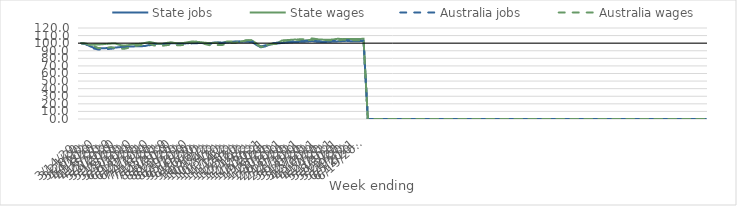
| Category | State jobs | State wages | Australia jobs | Australia wages |
|---|---|---|---|---|
| 14/03/2020 | 100 | 100 | 100 | 100 |
| 21/03/2020 | 99.006 | 98.823 | 98.971 | 99.604 |
| 28/03/2020 | 96.04 | 97.651 | 95.467 | 98.106 |
| 04/04/2020 | 93.963 | 98.119 | 92.922 | 96.239 |
| 11/04/2020 | 93.081 | 98.116 | 91.648 | 93.488 |
| 18/04/2020 | 93.187 | 98.667 | 91.632 | 93.693 |
| 25/04/2020 | 93.549 | 98.967 | 92.163 | 94.114 |
| 02/05/2020 | 93.881 | 99.429 | 92.661 | 94.661 |
| 09/05/2020 | 94.154 | 99.55 | 93.345 | 93.586 |
| 16/05/2020 | 94.774 | 97.702 | 93.938 | 92.82 |
| 23/05/2020 | 95.252 | 96.761 | 94.296 | 92.472 |
| 30/05/2020 | 95.409 | 97.328 | 94.804 | 93.802 |
| 06/06/2020 | 95.648 | 98.72 | 95.79 | 95.983 |
| 13/06/2020 | 95.904 | 98.745 | 96.291 | 96.659 |
| 20/06/2020 | 95.927 | 99.367 | 96.307 | 97.626 |
| 27/06/2020 | 96.358 | 100.405 | 95.924 | 97.398 |
| 04/07/2020 | 97.747 | 101.627 | 97.286 | 99.305 |
| 11/07/2020 | 98.921 | 100.388 | 98.453 | 96.936 |
| 18/07/2020 | 98.881 | 99.093 | 98.574 | 96.771 |
| 25/07/2020 | 99.025 | 99.092 | 98.8 | 96.557 |
| 01/08/2020 | 99.491 | 100.29 | 99.036 | 97.398 |
| 08/08/2020 | 99.735 | 101.152 | 99.039 | 97.865 |
| 15/08/2020 | 99.722 | 100.116 | 98.915 | 97.373 |
| 22/08/2020 | 99.63 | 99.797 | 99.01 | 97.336 |
| 29/08/2020 | 99.515 | 100.336 | 99.05 | 97.544 |
| 05/09/2020 | 99.94 | 101.32 | 99.381 | 100.291 |
| 12/09/2020 | 100.436 | 102.284 | 99.754 | 101.228 |
| 19/09/2020 | 100.439 | 101.783 | 99.918 | 101.971 |
| 26/09/2020 | 100.197 | 101.24 | 99.725 | 101.154 |
| 03/10/2020 | 99.791 | 100.485 | 98.937 | 98.795 |
| 10/10/2020 | 99.911 | 100.095 | 99.064 | 97.403 |
| 17/10/2020 | 100.735 | 100.328 | 99.896 | 98.12 |
| 24/10/2020 | 101.09 | 100.607 | 100.185 | 97.546 |
| 31/10/2020 | 100.581 | 100.266 | 100.363 | 97.615 |
| 07/11/2020 | 100.84 | 102.051 | 100.966 | 99.446 |
| 14/11/2020 | 101.225 | 102.123 | 101.741 | 100.424 |
| 21/11/2020 | 101.548 | 101.867 | 102.085 | 100.522 |
| 28/11/2020 | 101.636 | 101.95 | 102.383 | 101.813 |
| 05/12/2020 | 102.063 | 102.854 | 102.872 | 103.509 |
| 12/12/2020 | 101.782 | 103.671 | 102.957 | 104.014 |
| 19/12/2020 | 101.356 | 103.312 | 102.168 | 103.915 |
| 26/12/2020 | 97.513 | 99.568 | 98.391 | 98.452 |
| 02/01/2021 | 94.591 | 95.389 | 95.58 | 95.006 |
| 09/01/2021 | 95.702 | 96.537 | 96.988 | 96.148 |
| 16/01/2021 | 97.976 | 98.633 | 99.101 | 98.251 |
| 23/01/2021 | 99.141 | 99.948 | 100.068 | 98.817 |
| 30/01/2021 | 99.703 | 100.698 | 100.556 | 99.148 |
| 06/02/2021 | 100.313 | 103.619 | 100.923 | 102.467 |
| 13/02/2021 | 100.944 | 103.965 | 101.643 | 103.619 |
| 20/02/2021 | 101.15 | 104.388 | 101.902 | 103.78 |
| 27/02/2021 | 101.615 | 104.79 | 102.3 | 104.333 |
| 06/03/2021 | 101.711 | 104.228 | 102.521 | 105.064 |
| 13/03/2021 | 101.882 | 103.112 | 102.877 | 105.052 |
| 20/03/2021 | 102.232 | 103.96 | 103.384 | 105.539 |
| 27/03/2021 | 102.826 | 104.657 | 103.612 | 106.245 |
| 03/04/2021 | 101.931 | 104.662 | 102.769 | 105.395 |
| 10/04/2021 | 101.676 | 104.74 | 102.293 | 103.884 |
| 17/04/2021 | 101.606 | 104.574 | 102.308 | 104.211 |
| 24/04/2021 | 101.847 | 104.485 | 102.558 | 103.772 |
| 01/05/2021 | 102.222 | 104.959 | 102.806 | 104.122 |
| 08/05/2021 | 102.376 | 105.844 | 102.974 | 103.594 |
| 15/05/2021 | 102.733 | 105.314 | 103.642 | 104.439 |
| 22/05/2021 | 103.087 | 105.624 | 103.934 | 104.625 |
| 29/05/2021 | 102.587 | 105.453 | 103.744 | 104.038 |
| 05/06/2021 | 102.371 | 105.455 | 103.091 | 103.805 |
| 12/06/2021 | 102.628 | 105.433 | 103.033 | 103.851 |
| 19/06/2021 | 103.014 | 105.848 | 103.366 | 104.254 |